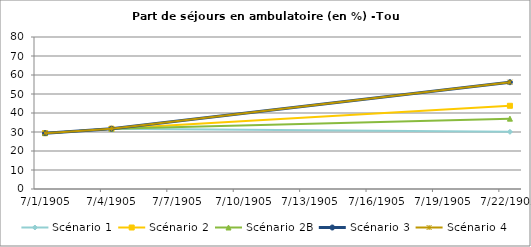
| Category | Scénario 1 | Scénario 2 | Scénario 2B | Scénario 3 | Scénario 4 |
|---|---|---|---|---|---|
| 2009.0 | 29.4 | 29.4 | 29.4 | 29.4 | 29.4 |
| 2012.0 | 31.734 | 31.734 | 31.734 | 31.734 | 31.734 |
| 2030.0 | 30.089 | 43.798 | 37.028 | 56.211 | 56.211 |